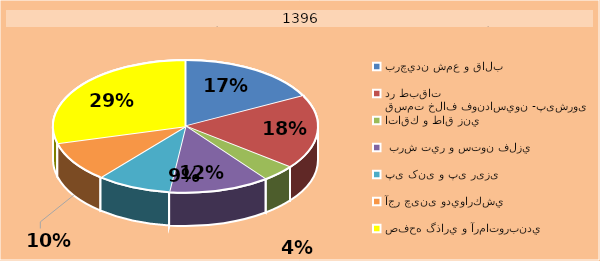
| Category | Series 0 |
|---|---|
| برچيدن شمع و قالب | 186 |
| قسمت خلاف فونداسيون -پیشروی در طبقات  | 193 |
| اتاقك و طاق زني | 44 |
|  برش تير و ستون فلزي | 131 |
| پی کنی و پی ریزی | 97 |
| آجر چینی وديواركشي  | 105 |
| صفحه گذاري و آرماتوربندي | 310 |